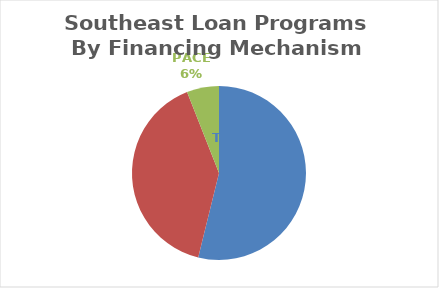
| Category | Series 0 |
|---|---|
| Traditional Loan | 63 |
| On Bill Financing | 47 |
| PACE | 7 |